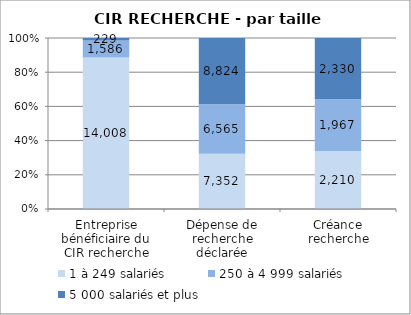
| Category | 1 à 249 salariés | 250 à 4 999 salariés | 5 000 salariés et plus |
|---|---|---|---|
| Entreprise bénéficiaire du CIR recherche | 14008 | 1586 | 229 |
| Dépense de recherche déclarée | 7352.12 | 6564.7 | 8824.17 |
| Créance recherche | 2210.05 | 1966.89 | 2329.94 |